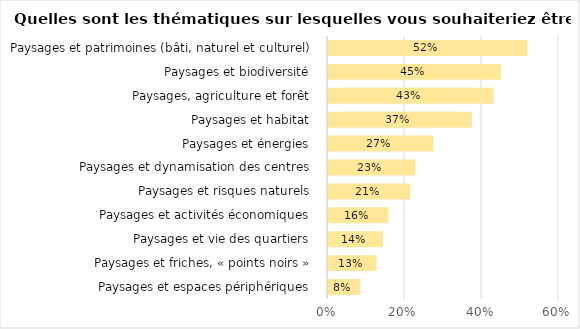
| Category | Series 0 |
|---|---|
| Paysages et espaces périphériques  | 0.084 |
| Paysages et friches, « points noirs »  | 0.126 |
| Paysages et vie des quartiers  | 0.142 |
| Paysages et activités économiques  | 0.157 |
| Paysages et risques naturels  | 0.214 |
| Paysages et dynamisation des centres  | 0.227 |
| Paysages et énergies  | 0.274 |
| Paysages et habitat  | 0.374 |
| Paysages, agriculture et forêt  | 0.431 |
| Paysages et biodiversité  | 0.449 |
| Paysages et patrimoines (bâti, naturel et culturel)  | 0.518 |